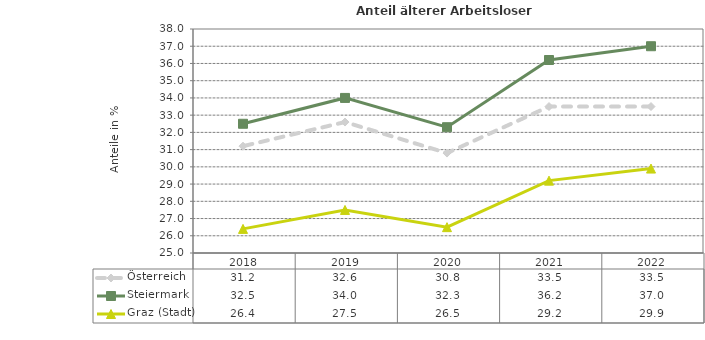
| Category | Österreich | Steiermark | Graz (Stadt) |
|---|---|---|---|
| 2022.0 | 33.5 | 37 | 29.9 |
| 2021.0 | 33.5 | 36.2 | 29.2 |
| 2020.0 | 30.8 | 32.3 | 26.5 |
| 2019.0 | 32.6 | 34 | 27.5 |
| 2018.0 | 31.2 | 32.5 | 26.4 |